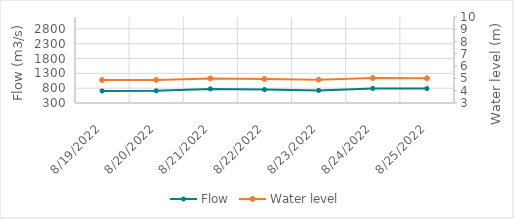
| Category | Flow |
|---|---|
| 4/26/22 | 2770.38 |
| 4/25/22 | 2883.07 |
| 4/24/22 | 3053.88 |
| 4/23/22 | 2913.33 |
| 4/22/22 | 2479.67 |
| 4/21/22 | 2250.75 |
| 4/20/22 | 2208.37 |